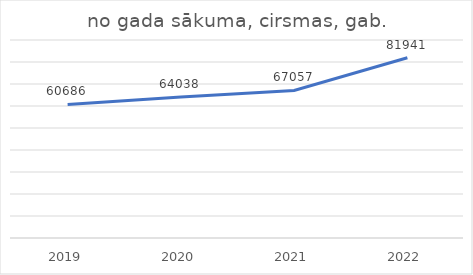
| Category | no gada sākuma, cirsmas, gab. |
|---|---|
| 2019.0 | 60686 |
| 2020.0 | 64038 |
| 2021.0 | 67057 |
| 2022.0 | 81941 |